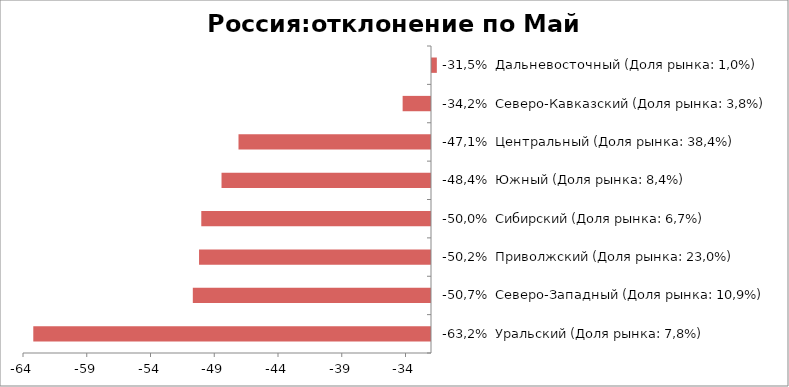
| Category | Россия:отклонение по Май 2015-2014 |
|---|---|
| -63,2%  Уральский (Доля рынка: 7,8%) | -63.193 |
| -50,7%  Северо-Западный (Доля рынка: 10,9%) | -50.681 |
| -50,2%  Приволжский (Доля рынка: 23,0%) | -50.192 |
| -50,0%  Сибирский (Доля рынка: 6,7%) | -50.017 |
| -48,4%  Южный (Доля рынка: 8,4%) | -48.429 |
| -47,1%  Центральный (Доля рынка: 38,4%) | -47.098 |
| -34,2%  Северо-Кавказский (Доля рынка: 3,8%) | -34.225 |
| -31,5%  Дальневосточный (Доля рынка: 1,0%) | -31.542 |